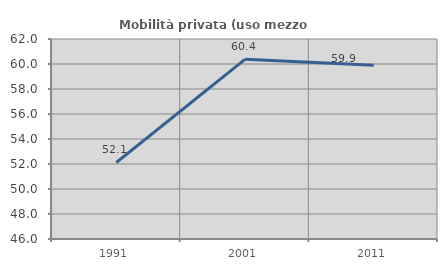
| Category | Mobilità privata (uso mezzo privato) |
|---|---|
| 1991.0 | 52.122 |
| 2001.0 | 60.372 |
| 2011.0 | 59.905 |